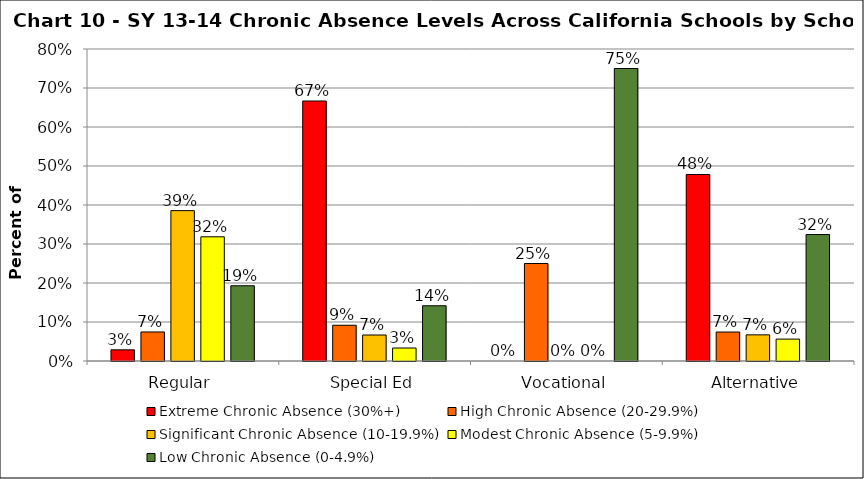
| Category | Extreme Chronic Absence (30%+) | High Chronic Absence (20-29.9%) | Significant Chronic Absence (10-19.9%) | Modest Chronic Absence (5-9.9%) | Low Chronic Absence (0-4.9%) |
|---|---|---|---|---|---|
| 0 | 0.029 | 0.074 | 0.386 | 0.318 | 0.193 |
| 1 | 0.667 | 0.092 | 0.067 | 0.033 | 0.142 |
| 2 | 0 | 0.25 | 0 | 0 | 0.75 |
| 3 | 0.478 | 0.074 | 0.067 | 0.056 | 0.324 |